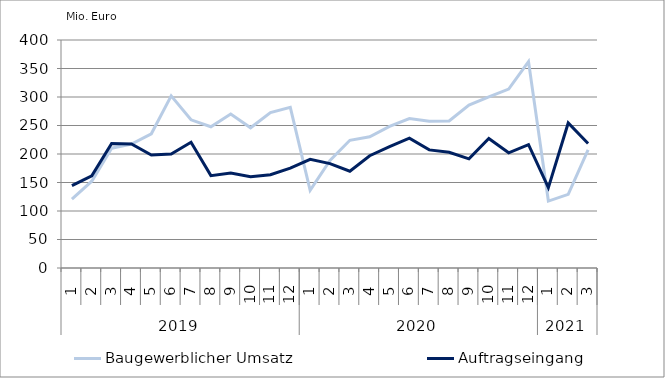
| Category | Baugewerblicher Umsatz | Auftragseingang |
|---|---|---|
| 0 | 120975.133 | 144510.881 |
| 1 | 152329.786 | 161685.201 |
| 2 | 210227.67 | 218455.879 |
| 3 | 217522.321 | 217610.064 |
| 4 | 235490.429 | 198110.439 |
| 5 | 301963.302 | 200012.086 |
| 6 | 259975.317 | 220559.061 |
| 7 | 247779.658 | 162059.723 |
| 8 | 270249.609 | 166829.611 |
| 9 | 245966.91 | 160120.773 |
| 10 | 272620.351 | 163589.389 |
| 11 | 281810.121 | 175051.247 |
| 12 | 136135.432 | 190647.086 |
| 13 | 188682.361 | 183141.14 |
| 14 | 224009.315 | 169770.009 |
| 15 | 230172.252 | 196979.845 |
| 16 | 248410.714 | 212955.83 |
| 17 | 262078.128 | 227853.487 |
| 18 | 257360.37 | 207209.188 |
| 19 | 257932.168 | 202976.091 |
| 20 | 285866.269 | 191463.844 |
| 21 | 300164.57 | 227245.467 |
| 22 | 313922.518 | 202060.636 |
| 23 | 362040.738 | 216296.504 |
| 24 | 117421.805 | 141020.655 |
| 25 | 129162.55 | 254416.876 |
| 26 | 207280.837 | 218451.405 |